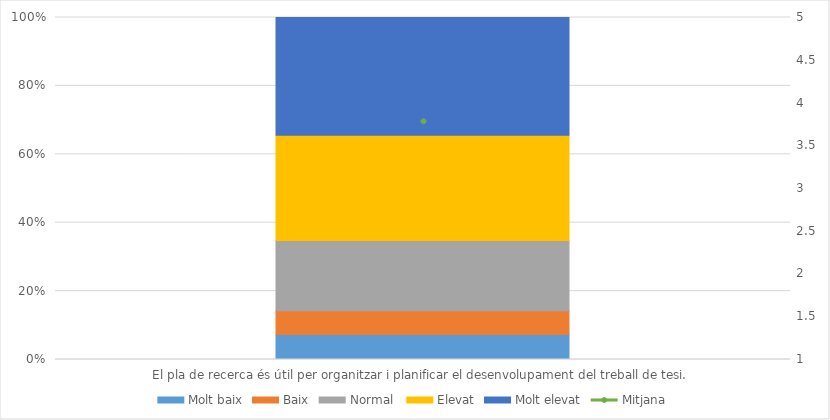
| Category | Molt baix | Baix | Normal  | Elevat | Molt elevat |
|---|---|---|---|---|---|
| El pla de recerca és útil per organitzar i planificar el desenvolupament del treball de tesi. | 22 | 21 | 62 | 93 | 104 |